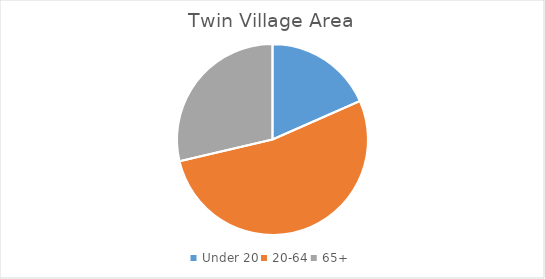
| Category | Twin Village Area |
|---|---|
| Under 20 | 0.184 |
| 20-64 | 0.529 |
| 65+ | 0.287 |